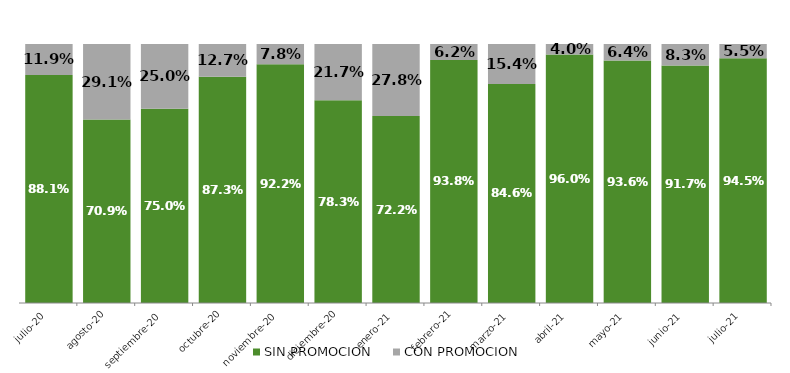
| Category | SIN PROMOCION   | CON PROMOCION   |
|---|---|---|
| 2020-07-01 | 0.881 | 0.119 |
| 2020-08-01 | 0.709 | 0.291 |
| 2020-09-01 | 0.75 | 0.25 |
| 2020-10-01 | 0.873 | 0.127 |
| 2020-11-01 | 0.922 | 0.078 |
| 2020-12-01 | 0.783 | 0.217 |
| 2021-01-01 | 0.722 | 0.278 |
| 2021-02-01 | 0.938 | 0.062 |
| 2021-03-01 | 0.846 | 0.154 |
| 2021-04-01 | 0.96 | 0.04 |
| 2021-05-01 | 0.936 | 0.064 |
| 2021-06-01 | 0.917 | 0.083 |
| 2021-07-01 | 0.945 | 0.055 |